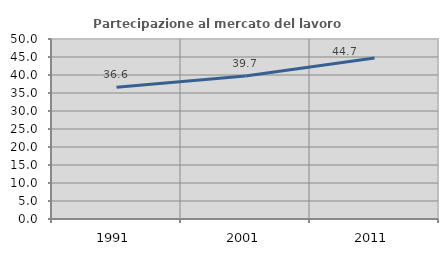
| Category | Partecipazione al mercato del lavoro  femminile |
|---|---|
| 1991.0 | 36.624 |
| 2001.0 | 39.701 |
| 2011.0 | 44.693 |